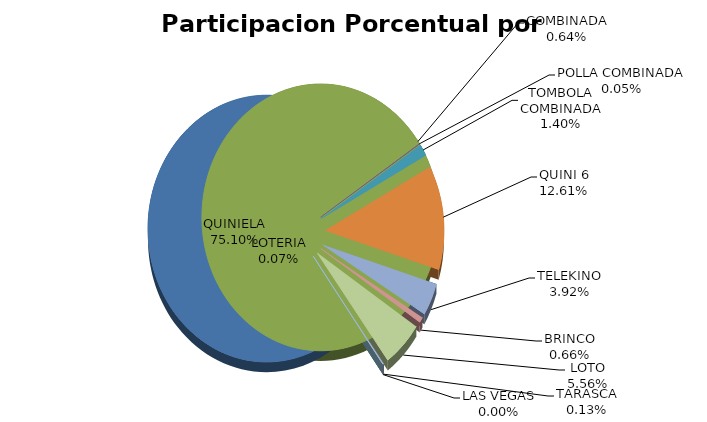
| Category | Series 0 |
|---|---|
| QUINIELA | 26343808.25 |
| COMBINADA | 225536.35 |
| LOTERIA | -23716.21 |
| POLLA COMBINADA | 18263.2 |
| TOMBOLA COMBINADA | 490972.5 |
| QUINI 6 | 4422320.02 |
| TELEKINO | 1375881 |
| BRINCO | 230884.73 |
| LOTO | 1949696.81 |
| TARASCA | 45394.25 |
| LAS VEGAS | 0 |